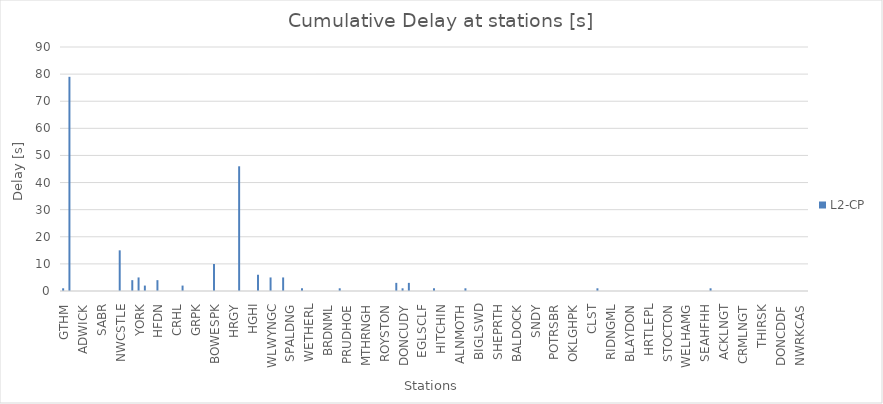
| Category | L2-CP |
|---|---|
| GTHM | 1 |
| DONC | 79 |
| BTLYSY | 0 |
| ADWICK | 0 |
| SELMSAL | 0 |
| FITZWLM | 0 |
| SABR | 0 |
| WKFLDWG | 0 |
| OUTWOOD | 0 |
| NWCSTLE | 15 |
| DRHM | 0 |
| DLTN | 4 |
| YORK | 5 |
| STEVNGE | 2 |
| WATONAS | 0 |
| HFDN | 4 |
| BAYFORD | 0 |
| CUFFLEY | 0 |
| CRHL | 0 |
| GORDONH | 2 |
| ENFC | 0 |
| GRPK | 0 |
| WNMHILL | 0 |
| PALMRSG | 0 |
| BOWESPK | 10 |
| ALEXNDP | 0 |
| HRNSY | 0 |
| HRGY | 0 |
| FNPK | 46 |
| DRYP | 0 |
| HGHI | 0 |
| ESSEXRD | 6 |
| OLDST | 0 |
| WLWYNGC | 5 |
| HNTNGDN | 0 |
| PBRO | 5 |
| SPALDNG | 0 |
| SLEFD | 0 |
| LINCLNC | 1 |
| WETHERL | 0 |
| BRMPTNC | 0 |
| HLTWHST | 0 |
| BRDNML | 0 |
| HYDB | 0 |
| HEXHAM | 1 |
| PRUDHOE | 0 |
| GTSHDMC | 0 |
| RSKNGTN | 0 |
| MTHRNGH | 0 |
| SAXILBY | 0 |
| GBGHLRD | 0 |
| ROYSTON | 0 |
| LTCE | 0 |
| DONCBDY | 3 |
| DONCUDY | 1 |
| DINSDAL | 3 |
| ALLENSW | 0 |
| EGLSCLF | 0 |
| BRWCKUT | 0 |
| JARRGBF | 1 |
| HITCHIN | 0 |
| RTFD | 0 |
| MRPTHRP | 0 |
| ALNMOTH | 0 |
| NEWANG | 1 |
| STNEOTS | 0 |
| BIGLSWD | 0 |
| MRCH | 0 |
| FOXTON | 0 |
| SHEPRTH | 0 |
| MELDRTH | 0 |
| ASHWELC | 0 |
| BALDOCK | 0 |
| KNEBWTH | 0 |
| WLWYNN | 0 |
| SNDY | 0 |
| ARLSEY | 0 |
| HATFILD | 0 |
| POTRSBR | 0 |
| HADLYWD | 0 |
| NBARNET | 0 |
| OKLGHPK | 0 |
| NEWSGAT | 0 |
| NLRTN | 0 |
| CLST | 0 |
| SNDRLND | 1 |
| CRBG | 0 |
| RIDNGML | 0 |
| STCKSFL | 0 |
| WYLAM | 0 |
| BLAYDON | 0 |
| HEWORTH | 0 |
| SEAHAM | 0 |
| HRTLEPL | 0 |
| SETNCRW | 0 |
| BLNGHM | 0 |
| STOCTON | 0 |
| DONCDDY | 0 |
| CLHM | 0 |
| WELHAMG | 0 |
| BRKMNPK | 0 |
| DONCBUR | 0 |
| SEAHFHH | 0 |
| CRAGMIL | 1 |
| CHHL | 0 |
| ACKLNGT | 0 |
| WDRNGTN | 0 |
| PEGSWD | 0 |
| CRMLNGT | 0 |
| DONCRPF | 0 |
| DNSN | 0 |
| THIRSK | 0 |
| PBROVGB | 0 |
| PBROEFL | 0 |
| DONCDDF | 0 |
| DONCRPG | 0 |
| MANORS | 0 |
| NWRKCAS | 0 |
| HYKEHAM | 0 |